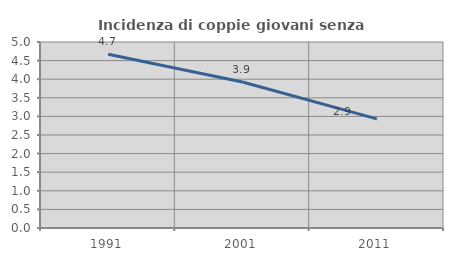
| Category | Incidenza di coppie giovani senza figli |
|---|---|
| 1991.0 | 4.673 |
| 2001.0 | 3.925 |
| 2011.0 | 2.934 |